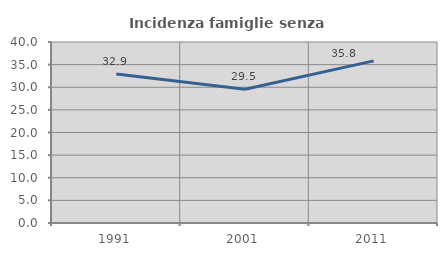
| Category | Incidenza famiglie senza nuclei |
|---|---|
| 1991.0 | 32.941 |
| 2001.0 | 29.54 |
| 2011.0 | 35.831 |